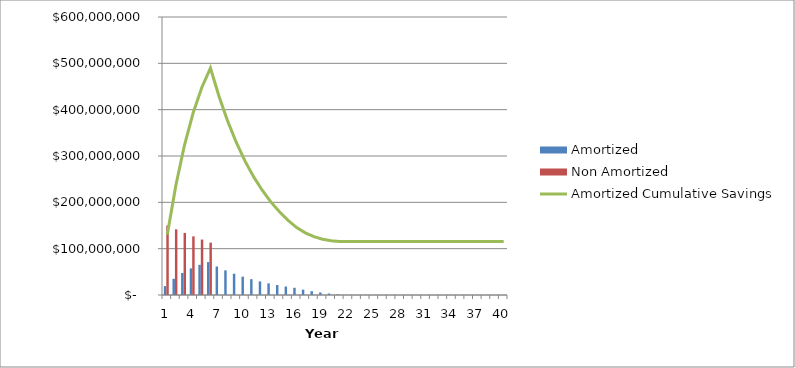
| Category | Amortized | Non Amortized |
|---|---|---|
| 0 | 19218750 | 150000000 |
| 1 | 34867968.75 | 141750000 |
| 2 | 47454292.969 | 133953750 |
| 3 | 57419556.855 | 126586293.75 |
| 4 | 65148640.603 | 119624047.594 |
| 5 | 70976399.745 | 113044724.976 |
| 6 | 61506537.199 | 0 |
| 7 | 53220883.165 | 0 |
| 8 | 45977294.566 | 0 |
| 9 | 39650214.854 | 0 |
| 10 | 34128778.14 | 0 |
| 11 | 29315126.62 | 0 |
| 12 | 25122917.622 | 0 |
| 13 | 21475999.158 | 0 |
| 14 | 18307235.21 | 0 |
| 15 | 15557464.061 | 0 |
| 16 | 11558972.812 | 0 |
| 17 | 8241347.088 | 0 |
| 18 | 5506377.891 | 0 |
| 19 | 3268800.512 | 0 |
| 20 | 1454681.65 | 0 |
| 21 | 0 | 0 |
| 22 | 0 | 0 |
| 23 | 0 | 0 |
| 24 | 0 | 0 |
| 25 | 0 | 0 |
| 26 | 0 | 0 |
| 27 | 0 | 0 |
| 28 | 0 | 0 |
| 29 | 0 | 0 |
| 30 | 0 | 0 |
| 31 | 0 | 0 |
| 32 | 0 | 0 |
| 33 | 0 | 0 |
| 34 | 0 | 0 |
| 35 | 0 | 0 |
| 36 | 0 | 0 |
| 37 | 0 | 0 |
| 38 | 0 | 0 |
| 39 | 0 | 0 |